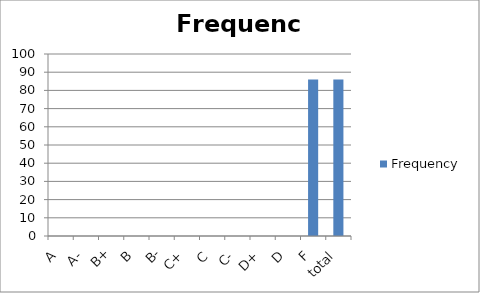
| Category | Frequency |
|---|---|
| A | 0 |
| A- | 0 |
| B+ | 0 |
| B | 0 |
| B- | 0 |
| C+ | 0 |
| C | 0 |
| C- | 0 |
| D+ | 0 |
| D | 0 |
| F | 86 |
| total | 86 |